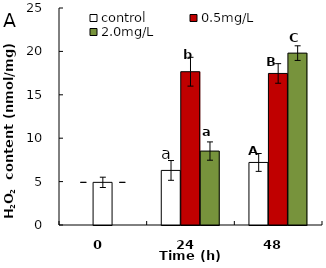
| Category | control | 0.5mg/L | 2.0mg/L |
|---|---|---|---|
| 0.0 | 4.913 | 4.913 | 4.913 |
| 24.0 | 6.289 | 17.66 | 8.518 |
| 48.0 | 7.207 | 17.46 | 19.802 |